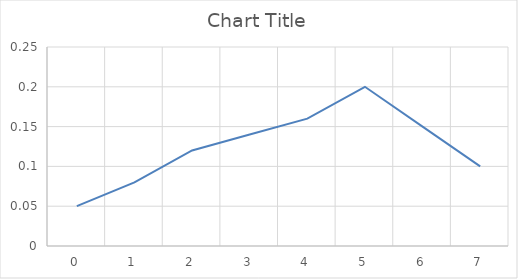
| Category | Series 0 |
|---|---|
| 0.0 | 0.05 |
| 1.0 | 0.08 |
| 2.0 | 0.12 |
| 3.0 | 0.14 |
| 4.0 | 0.16 |
| 5.0 | 0.2 |
| 6.0 | 0.15 |
| 7.0 | 0.1 |